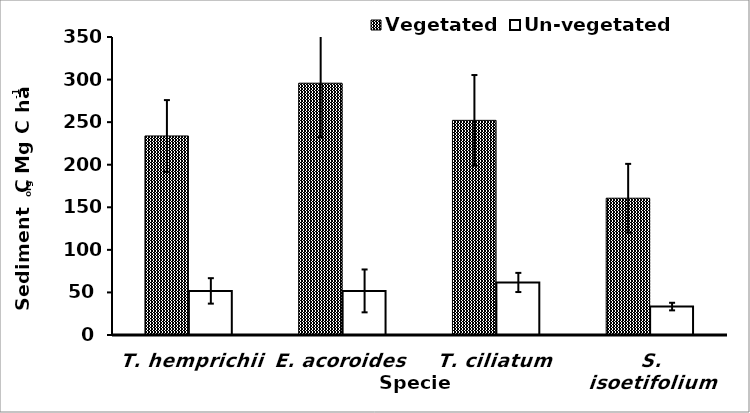
| Category | Vegetated | Un-vegetated |
|---|---|---|
| T. hemprichii | 233.774 | 51.795 |
| E. acoroides | 295.741 | 51.793 |
| T. ciliatum | 252.101 | 61.705 |
| S. isoetifolium | 160.654 | 33.391 |